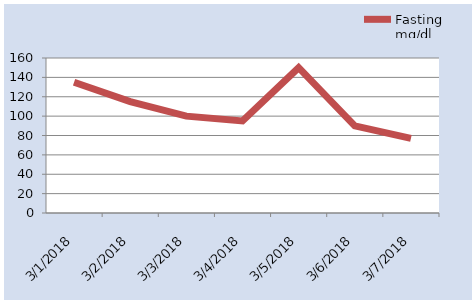
| Category | Fasting mg/dl |
|---|---|
| 01/03/2018 | 135 |
| 02/03/2018 | 115 |
| 03/03/2018 | 100 |
| 04/03/2018 | 95 |
| 05/03/2018 | 150 |
| 06/03/2018 | 90 |
| 07/03/2018 | 77 |